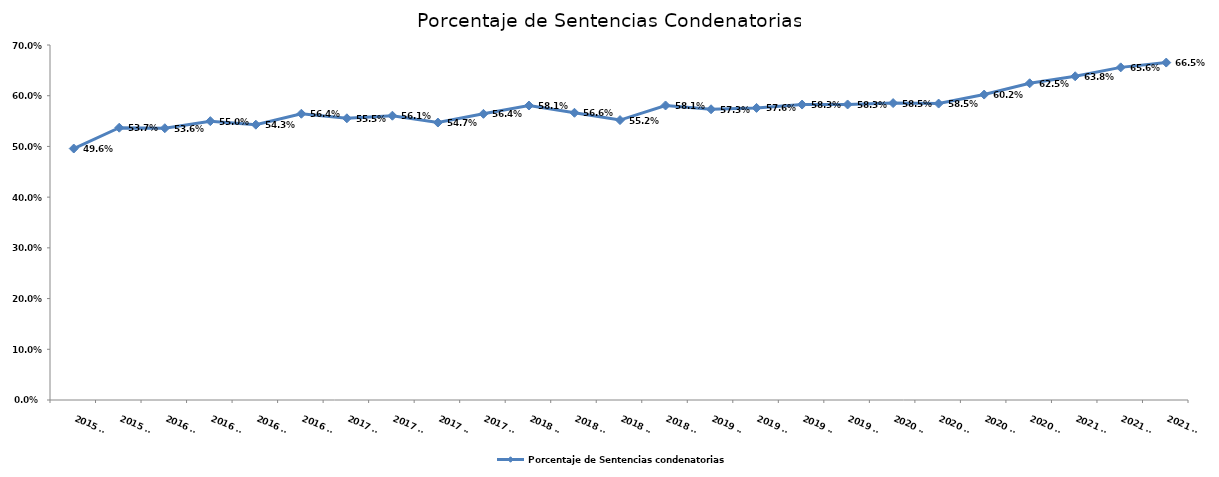
| Category | Porcentaje de Sentencias condenatorias |
|---|---|
| 2015 T3 | 0.496 |
| 2015 T4 | 0.537 |
| 2016 T1 | 0.536 |
| 2016 T2 | 0.55 |
| 2016 T3 | 0.543 |
| 2016 T4 | 0.564 |
| 2017 T1 | 0.555 |
| 2017 T2 | 0.561 |
| 2017 T3 | 0.547 |
| 2017 T4 | 0.564 |
| 2018 T1 | 0.581 |
| 2018 T2 | 0.566 |
| 2018 T3 | 0.552 |
| 2018 T4 | 0.581 |
| 2019 T1 | 0.573 |
| 2019 T2 | 0.576 |
| 2019 T3 | 0.583 |
| 2019 T4 | 0.583 |
| 2020 T1 | 0.585 |
| 2020 T2 | 0.585 |
| 2020 T3 | 0.602 |
| 2020 T4 | 0.625 |
| 2021 T1 | 0.638 |
| 2021 T2 | 0.656 |
| 2021 T3 | 0.665 |